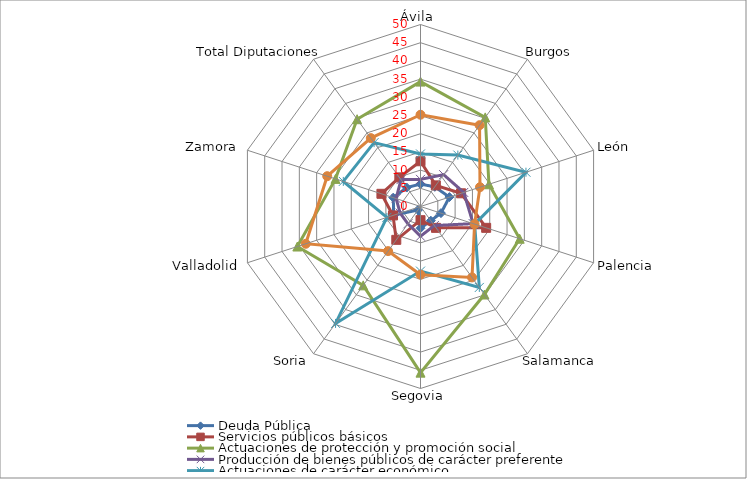
| Category | Deuda Pública | Servicios públicos básicos | Actuaciones de protección y promoción social | Producción de bienes públicos de carácter preferente | Actuaciones de carácter económico | Actuaciones de carácter general |
|---|---|---|---|---|---|---|
|  Ávila   | 6.151 | 12.435 | 34.311 | 7.453 | 14.443 | 25.207 |
|  Burgos   | 6.686 | 7.169 | 30.26 | 10.813 | 17.46 | 27.613 |
|  León   | 8.353 | 11.73 | 19.775 | 12.497 | 30.465 | 17.179 |
|  Palencia   | 5.907 | 18.97 | 28.649 | 15.215 | 15.638 | 15.623 |
|  Salamanca   | 4.822 | 7.252 | 29.884 | 6.473 | 27.489 | 24.081 |
|  Segovia   | 5.965 | 3.762 | 45.639 | 8.164 | 17.746 | 18.723 |
|  Soria   | 1.185 | 11.319 | 26.775 | 5.881 | 39.702 | 15.138 |
|  Valladolid   | 7.745 | 7.943 | 35.579 | 5.875 | 9.705 | 33.153 |
|  Zamora   | 7.87 | 11.286 | 24.554 | 7.042 | 22.298 | 26.949 |
|  Total Diputaciones   | 6.434 | 9.889 | 29.637 | 9.122 | 21.696 | 23.223 |